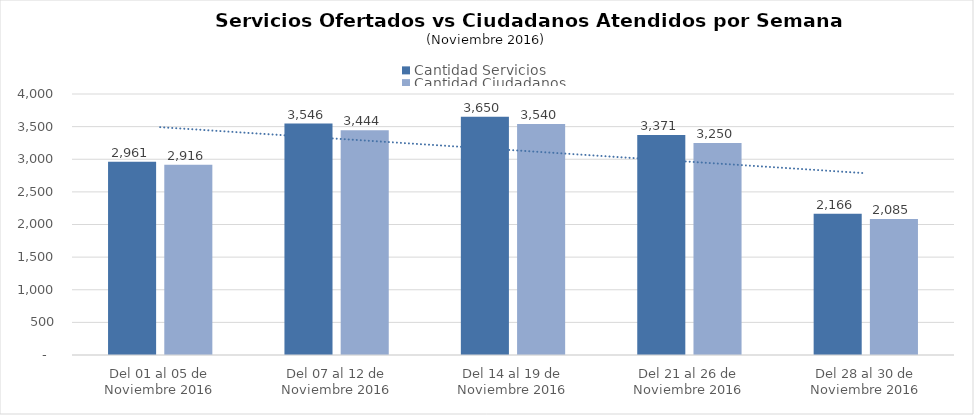
| Category | Cantidad Servicios | Cantidad Ciudadanos |
|---|---|---|
| Del 01 al 05 de Noviembre 2016 | 2961 | 2916 |
| Del 07 al 12 de Noviembre 2016 | 3546 | 3444 |
| Del 14 al 19 de Noviembre 2016 | 3650 | 3540 |
| Del 21 al 26 de Noviembre 2016 | 3371 | 3250 |
| Del 28 al 30 de Noviembre 2016 | 2166 | 2085 |